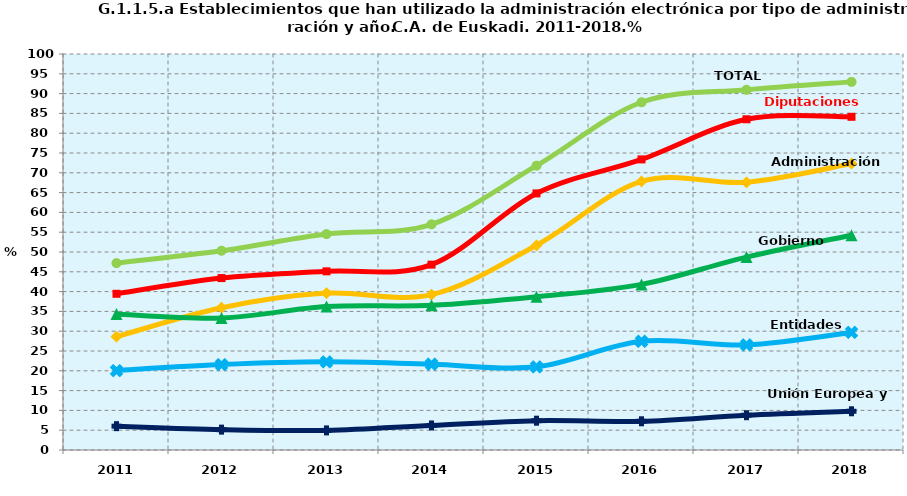
| Category | TOTAL | Diputaciones Forales | Administración Central | Gobierno Vasco | Entidades Locales | Unión Europea y Otros |
|---|---|---|---|---|---|---|
| 2011.0 | 47.195 | 39.446 | 28.619 | 34.347 | 20.063 | 6.017 |
| 2012.0 | 50.321 | 43.417 | 35.926 | 33.339 | 21.568 | 5.144 |
| 2013.0 | 54.524 | 45.118 | 39.622 | 36.207 | 22.264 | 4.948 |
| 2014.0 | 56.986 | 46.807 | 39.221 | 36.539 | 21.658 | 6.198 |
| 2015.0 | 71.8 | 64.8 | 51.7 | 38.7 | 21 | 7.4 |
| 2016.0 | 87.813 | 73.385 | 67.853 | 41.82 | 27.461 | 7.249 |
| 2017.0 | 90.959 | 83.514 | 67.612 | 48.718 | 26.543 | 8.784 |
| 2018.0 | 92.961 | 84.142 | 72.311 | 54.229 | 29.694 | 9.782 |